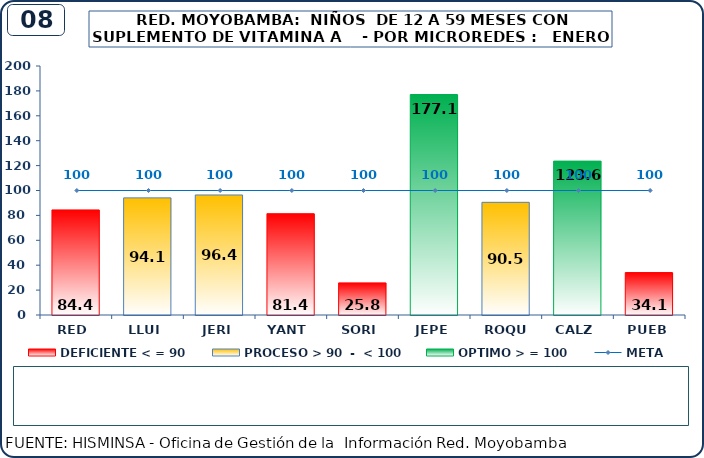
| Category | DEFICIENTE < = 90 | PROCESO > 90  -  < 100 | OPTIMO > = 100 |
|---|---|---|---|
| RED | 84.4 | 0 | 0 |
| LLUI | 0 | 94.1 | 0 |
| JERI | 0 | 96.4 | 0 |
| YANT | 81.4 | 0 | 0 |
| SORI | 25.8 | 0 | 0 |
| JEPE | 0 | 0 | 177.1 |
| ROQU | 0 | 90.5 | 0 |
| CALZ | 0 | 0 | 123.6 |
| PUEB | 34.1 | 0 | 0 |